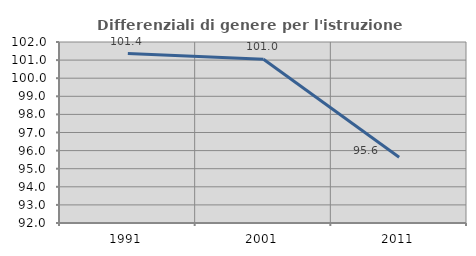
| Category | Differenziali di genere per l'istruzione superiore |
|---|---|
| 1991.0 | 101.36 |
| 2001.0 | 101.044 |
| 2011.0 | 95.628 |